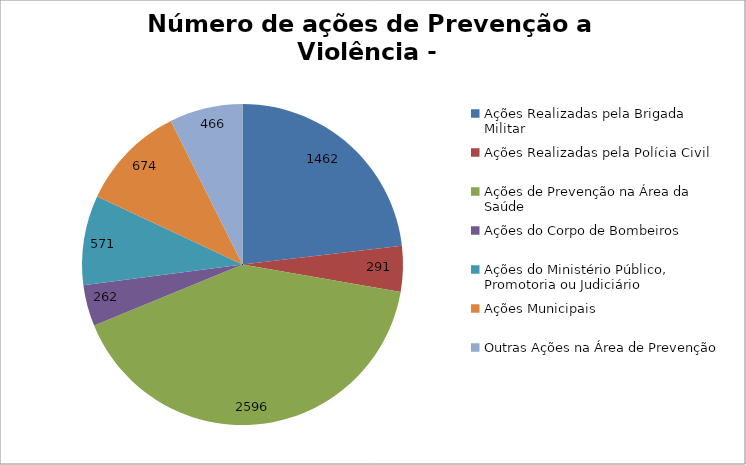
| Category | Número de Ações |
|---|---|
| Ações Realizadas pela Brigada Militar | 1462 |
| Ações Realizadas pela Polícia Civil | 291 |
| Ações de Prevenção na Área da Saúde | 2596 |
| Ações do Corpo de Bombeiros | 262 |
| Ações do Ministério Público, Promotoria ou Judiciário | 571 |
| Ações Municipais | 674 |
| Outras Ações na Área de Prevenção | 466 |